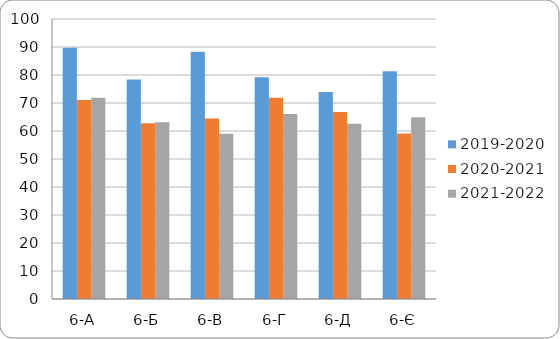
| Category | 2019-2020 | 2020-2021 | 2021-2022 |
|---|---|---|---|
| 6-А | 89.7 | 71.1 | 71.9 |
| 6-Б | 78.4 | 62.8 | 63.1 |
| 6-В | 88.3 | 64.5 | 59 |
| 6-Г | 79.2 | 71.9 | 66.1 |
| 6-Д | 73.9 | 66.8 | 62.6 |
| 6-Є | 81.3 | 59.1 | 64.9 |